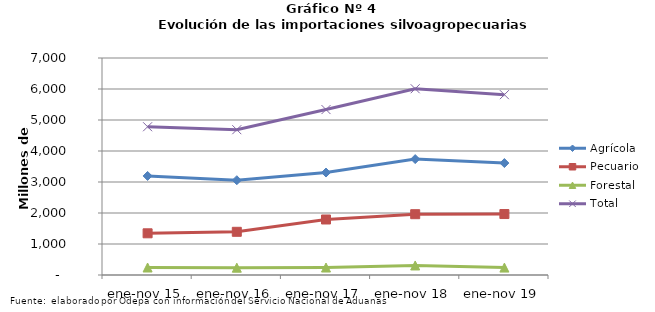
| Category | Agrícola | Pecuario | Forestal | Total |
|---|---|---|---|---|
| ene-nov 15 | 3195390 | 1345043 | 241847 | 4782280 |
| ene-nov 16 | 3057952 | 1393363 | 235879 | 4687194 |
| ene-nov 17 | 3305225 | 1790364 | 241068 | 5336657 |
| ene-nov 18 | 3739360 | 1961635 | 307528 | 6008523 |
| ene-nov 19 | 3611274 | 1966561 | 239177 | 5817012 |